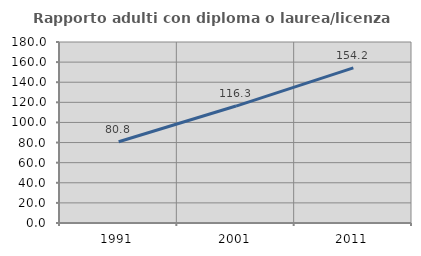
| Category | Rapporto adulti con diploma o laurea/licenza media  |
|---|---|
| 1991.0 | 80.797 |
| 2001.0 | 116.301 |
| 2011.0 | 154.203 |